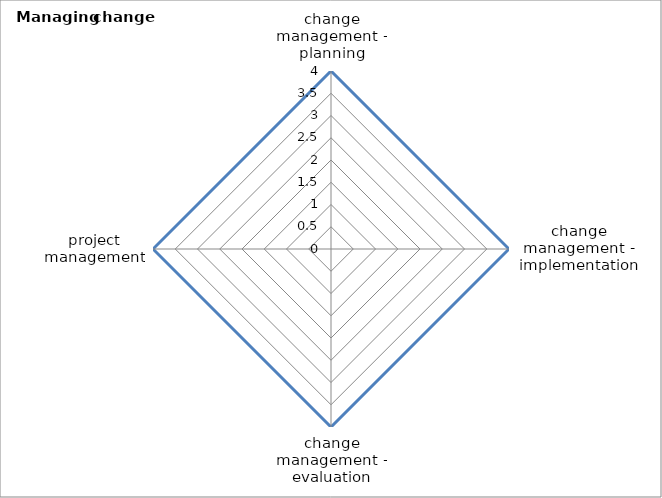
| Category | Series 0 | Series 1 |
|---|---|---|
| change management - planning | 4 |  |
| change management - implementation | 4 |  |
| change management - evaluation | 4 |  |
| project management | 4 |  |